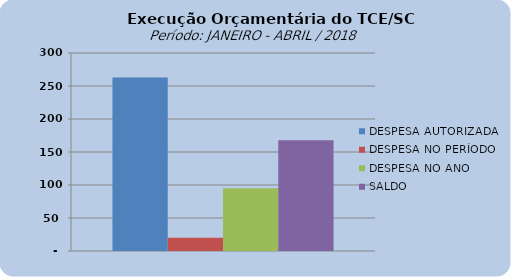
| Category | DESPESA AUTORIZADA | DESPESA NO PERÍODO | DESPESA NO ANO | SALDO |
|---|---|---|---|---|
| 0 | 263000593.19 | 20018078.72 | 95096015.72 | 167904577.47 |